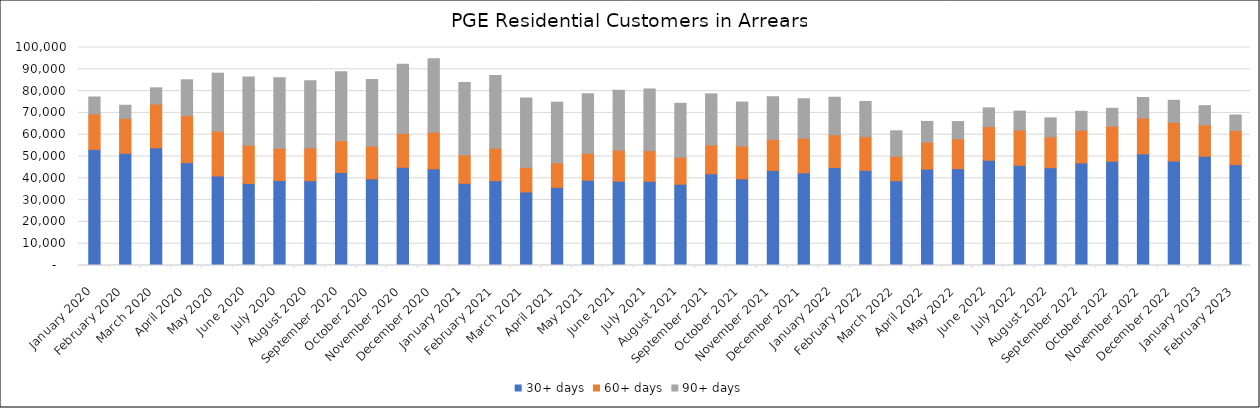
| Category | 30+ days | 60+ days | 90+ days |
|---|---|---|---|
| 2020-01-01 | 53242 | 16304 | 7752 |
| 2020-02-01 | 51467 | 16018 | 6027 |
| 2020-03-01 | 53989 | 20084 | 7427 |
| 2020-04-01 | 47202 | 21596 | 16379 |
| 2020-05-01 | 41089 | 20528 | 26598 |
| 2020-06-01 | 37584 | 17596 | 31338 |
| 2020-07-01 | 38960 | 14830 | 32346 |
| 2020-08-01 | 38887 | 15033 | 30857 |
| 2020-09-01 | 42647 | 14630 | 31635 |
| 2020-10-01 | 39740 | 15056 | 30522 |
| 2020-11-01 | 45033 | 15490 | 31754 |
| 2020-12-01 | 44326 | 16741 | 33761 |
| 2021-01-01 | 37684 | 12999 | 33305 |
| 2021-02-01 | 38907 | 14847 | 33377 |
| 2021-03-01 | 33733 | 11347 | 31743 |
| 2021-04-01 | 35845 | 11248 | 27821 |
| 2021-05-01 | 39122 | 12340 | 27318 |
| 2021-06-01 | 38665 | 14247 | 27476 |
| 2021-07-01 | 38630 | 14067 | 28280 |
| 2021-08-01 | 37269 | 12353 | 24776 |
| 2021-09-01 | 42077 | 13210 | 23429 |
| 2021-10-01 | 39745 | 15108 | 20137 |
| 2021-11-01 | 43618 | 14280 | 19508 |
| 2021-12-01 | 42504 | 15893 | 18090 |
| 2022-01-01 | 44894 | 15092 | 17198 |
| 2022-02-01 | 43637 | 15485 | 16128 |
| 2022-03-01 | 38872 | 11253 | 11648 |
| 2022-04-01 | 44226 | 12381 | 9483 |
| 2022-05-01 | 44433 | 13701 | 7887 |
| 2022-06-01 | 48270 | 15423 | 8604 |
| 2022-07-01 | 45897 | 16301 | 8634 |
| 2022-08-01 | 44872 | 14148 | 8702 |
| 2022-09-01 | 47056 | 14983 | 8686 |
| 2022-10-01 | 47844 | 16111 | 8132 |
| 2022-11-01 | 51228 | 16428 | 9400 |
| 2022-12-01 | 47930 | 17746 | 10094 |
| 2023-01-01 | 50137 | 14378 | 8810 |
| 2023-02-01 | 46277 | 15661 | 7107 |